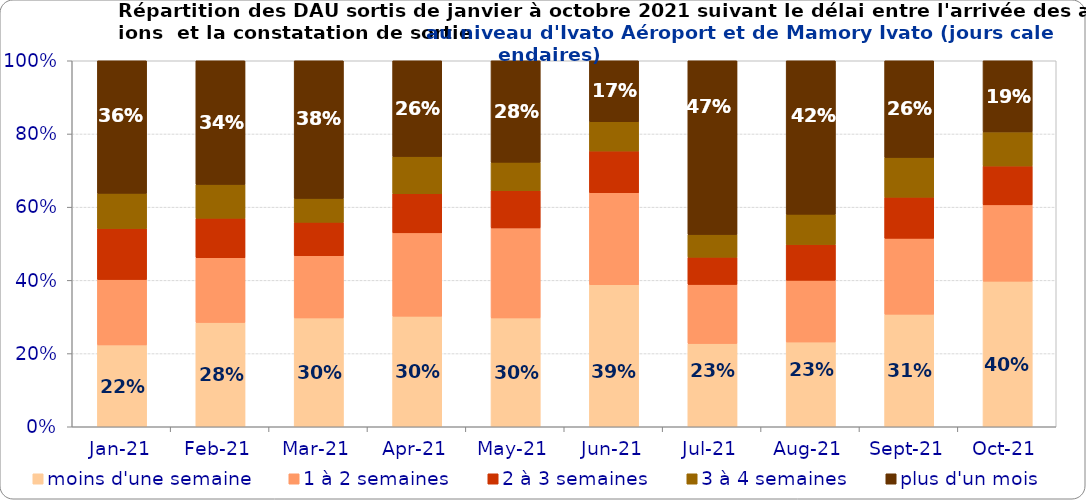
| Category | moins d'une semaine | 1 à 2 semaines | 2 à 3 semaines | 3 à 4 semaines | plus d'un mois |
|---|---|---|---|---|---|
| 2021-01-01 | 0.224 | 0.179 | 0.14 | 0.096 | 0.362 |
| 2021-02-01 | 0.285 | 0.177 | 0.108 | 0.092 | 0.338 |
| 2021-03-01 | 0.297 | 0.17 | 0.091 | 0.065 | 0.376 |
| 2021-04-01 | 0.302 | 0.228 | 0.107 | 0.101 | 0.262 |
| 2021-05-01 | 0.297 | 0.246 | 0.102 | 0.077 | 0.277 |
| 2021-06-01 | 0.388 | 0.251 | 0.114 | 0.08 | 0.167 |
| 2021-07-01 | 0.227 | 0.162 | 0.074 | 0.062 | 0.475 |
| 2021-08-01 | 0.232 | 0.169 | 0.098 | 0.083 | 0.419 |
| 2021-09-01 | 0.308 | 0.207 | 0.112 | 0.108 | 0.264 |
| 2021-10-01 | 0.398 | 0.208 | 0.106 | 0.093 | 0.194 |